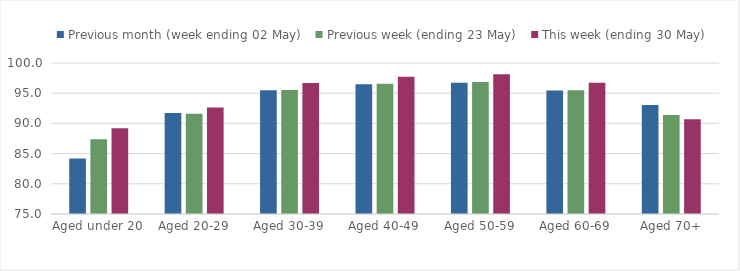
| Category | Previous month (week ending 02 May) | Previous week (ending 23 May) | This week (ending 30 May) |
|---|---|---|---|
| Aged under 20 | 84.197 | 87.369 | 89.2 |
| Aged 20-29 | 91.711 | 91.592 | 92.632 |
| Aged 30-39 | 95.505 | 95.532 | 96.669 |
| Aged 40-49 | 96.467 | 96.563 | 97.74 |
| Aged 50-59 | 96.724 | 96.86 | 98.148 |
| Aged 60-69 | 95.444 | 95.5 | 96.714 |
| Aged 70+ | 93.045 | 91.377 | 90.702 |